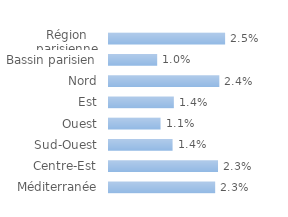
| Category | Series 0 |
|---|---|
| Région parisienne | 0.025 |
| Bassin parisien | 0.01 |
| Nord | 0.024 |
| Est | 0.014 |
| Ouest | 0.011 |
| Sud-Ouest | 0.014 |
| Centre-Est | 0.023 |
| Méditerranée | 0.023 |